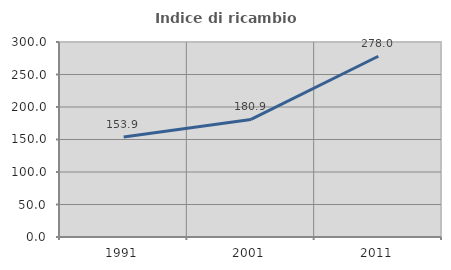
| Category | Indice di ricambio occupazionale  |
|---|---|
| 1991.0 | 153.906 |
| 2001.0 | 180.916 |
| 2011.0 | 278.03 |